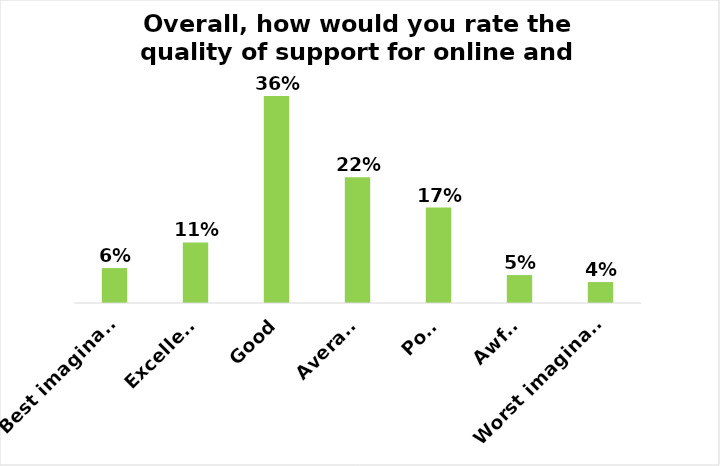
| Category | Overall, how would you rate the quality of support for online and virtual research? |
|---|---|
| Best imaginable | 0.061 |
| Excellent | 0.106 |
| Good | 0.362 |
| Average | 0.22 |
| Poor | 0.167 |
| Awful | 0.049 |
| Worst imaginable | 0.037 |